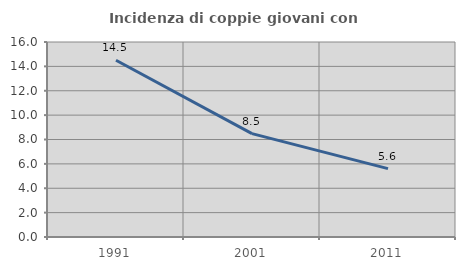
| Category | Incidenza di coppie giovani con figli |
|---|---|
| 1991.0 | 14.501 |
| 2001.0 | 8.478 |
| 2011.0 | 5.61 |